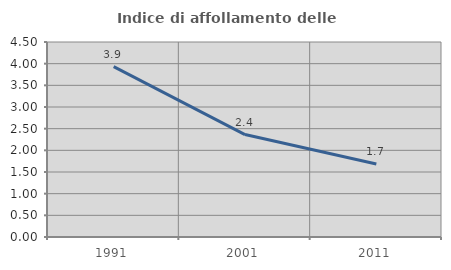
| Category | Indice di affollamento delle abitazioni  |
|---|---|
| 1991.0 | 3.931 |
| 2001.0 | 2.364 |
| 2011.0 | 1.685 |